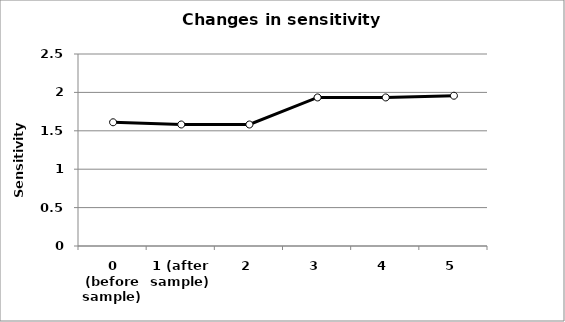
| Category | Sensitivity [V/µM] |
|---|---|
| 0 (before sample) | 1.611 |
| 1 (after sample) | 1.582 |
| 2 | 1.582 |
| 3 | 1.934 |
| 4 | 1.934 |
| 5 | 1.957 |